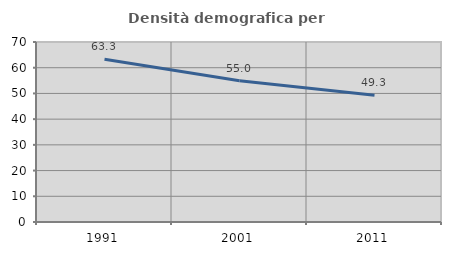
| Category | Densità demografica |
|---|---|
| 1991.0 | 63.28 |
| 2001.0 | 54.955 |
| 2011.0 | 49.268 |